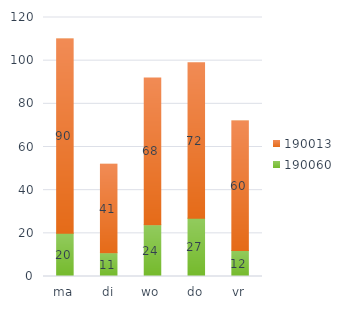
| Category | 190060 | 190013 |
|---|---|---|
| ma | 20 | 90 |
| di | 11 | 41 |
| wo | 24 | 68 |
| do | 27 | 72 |
| vr | 12 | 60 |